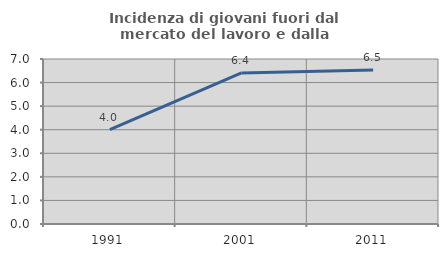
| Category | Incidenza di giovani fuori dal mercato del lavoro e dalla formazione  |
|---|---|
| 1991.0 | 4 |
| 2001.0 | 6.41 |
| 2011.0 | 6.536 |